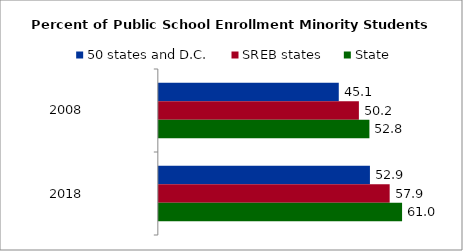
| Category | 50 states and D.C. | SREB states | State |
|---|---|---|---|
| 2008.0 | 45.112 | 50.153 | 52.79 |
| 2018.0 | 52.921 | 57.869 | 60.981 |